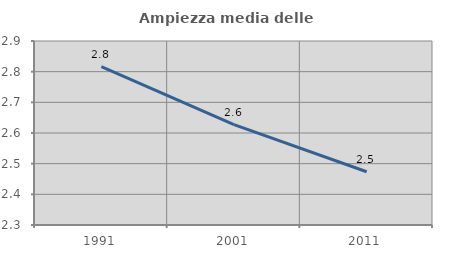
| Category | Ampiezza media delle famiglie |
|---|---|
| 1991.0 | 2.816 |
| 2001.0 | 2.627 |
| 2011.0 | 2.474 |